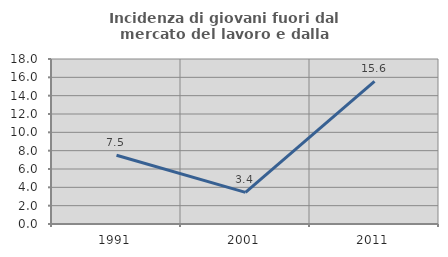
| Category | Incidenza di giovani fuori dal mercato del lavoro e dalla formazione  |
|---|---|
| 1991.0 | 7.5 |
| 2001.0 | 3.448 |
| 2011.0 | 15.556 |